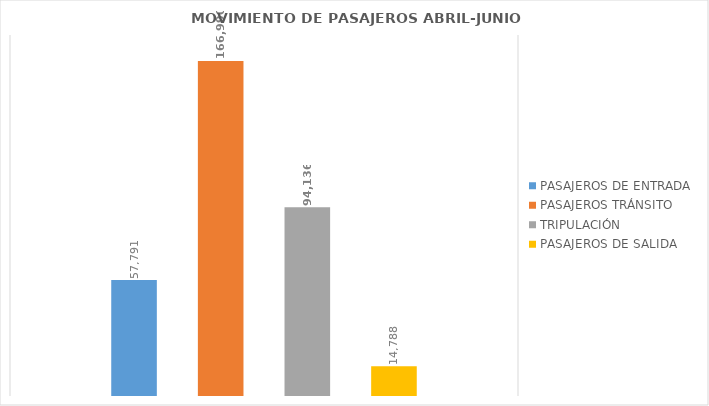
| Category | PASAJEROS DE ENTRADA | PASAJEROS TRÁNSITO | TRIPULACIÓN | PASAJEROS DE SALIDA |
|---|---|---|---|---|
| 0 | 57791 | 166990 | 94136 | 14788 |